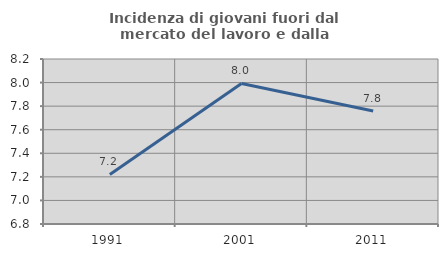
| Category | Incidenza di giovani fuori dal mercato del lavoro e dalla formazione  |
|---|---|
| 1991.0 | 7.22 |
| 2001.0 | 7.993 |
| 2011.0 | 7.758 |